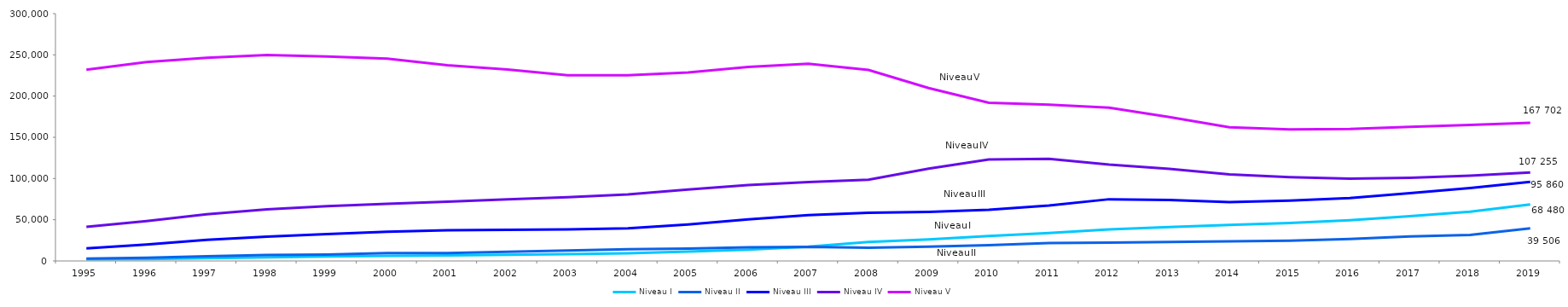
| Category | Niveau I | Niveau II | Niveau III | Niveau IV | Niveau V |
|---|---|---|---|---|---|
| 1995 | 1948 | 2829 | 15273 | 41327 | 232062 |
| 1996 | 2441 | 3916 | 19952 | 48438 | 241182 |
| 1997 | 3250 | 5768 | 25603 | 56579 | 246490 |
| 1998 | 4436 | 7143 | 29581 | 62622 | 249850 |
| 1999 | 5397 | 7780 | 32507 | 66469 | 248084 |
| 2000 | 6185 | 9448 | 35553 | 69355 | 245333 |
| 2001 | 6852 | 9568 | 37234 | 71828 | 237446 |
| 2002 | 7514 | 11243 | 37751 | 74802 | 232166 |
| 2003 | 8378 | 12674 | 38217 | 77362 | 225335 |
| 2004 | 9407 | 14124 | 39560 | 80623 | 225274 |
| 2005 | 11341 | 15063 | 44233 | 86609 | 228613 |
| 2006 | 13690 | 16461 | 50316 | 91951 | 235391 |
| 2007 | 17340 | 17198 | 55577 | 95753 | 239294 |
| 2008 | 22928 | 16021 | 58572 | 98470 | 231659 |
| 2009 | 26156 | 17387 | 59532 | 111900 | 209767 |
| 2010 | 30142 | 19189 | 62074 | 123018 | 191857 |
| 2011 | 33931 | 21762 | 67193 | 123888 | 189560 |
| 2012 | 38182 | 22321 | 74868 | 116897 | 185875 |
| 2013 | 41027 | 22937 | 74048 | 111682 | 174654 |
| 2014 | 43614 | 23743 | 71419 | 104880 | 162226 |
| 2015 | 46041 | 24655 | 73317 | 101582 | 159610 |
| 2016 | 49523 | 26605 | 76326 | 99814 | 159998 |
| 2017 | 54364 | 29740 | 82200 | 100952 | 162650 |
| 2018 | 59667 | 31582 | 88551 | 103453 | 164874 |
| 2019 | 68480 | 39506 | 95860 | 107255 | 167702 |